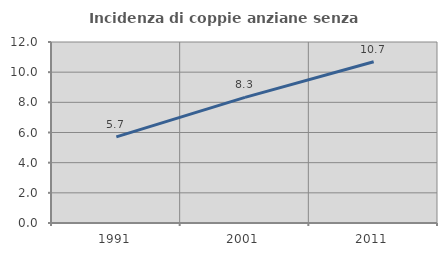
| Category | Incidenza di coppie anziane senza figli  |
|---|---|
| 1991.0 | 5.71 |
| 2001.0 | 8.327 |
| 2011.0 | 10.691 |